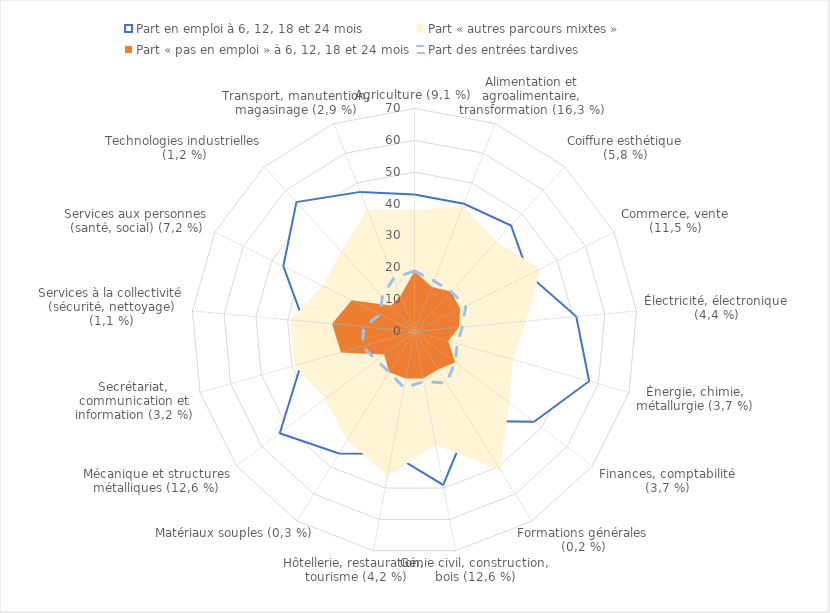
| Category | Part en emploi à 6, 12, 18 et 24 mois | Part « autres parcours mixtes » | Part « pas en emploi » à 6, 12, 18 et 24 mois | Part des entrées tardives |
|---|---|---|---|---|
| Agriculture (9,1 %) | 43 | 38 | 19 | 19 |
| Alimentation et agroalimentaire, transformation (16,3 %) | 43 | 42 | 15 | 17 |
| Coiffure esthétique (5,8 %) | 45 | 38 | 17 | 17 |
| Commerce, vente (11,5 %) | 40 | 44 | 16 | 18 |
| Électricité, électronique (4,4 %) | 51 | 35 | 14 | 15 |
| Énergie, chimie, métallurgie (3,7 %) | 57 | 32 | 11 | 14 |
| Finances, comptabilité (3,7 %) | 47 | 37 | 16 | 16 |
| Formations générales (0,2 %) | 33 | 51 | 14 | 19 |
| Génie civil, construction, bois (12,6 %) | 49 | 36 | 15 | 16 |
| Hôtellerie, restauration, tourisme (4,2 %) | 39 | 46 | 15 | 18 |
| Matériaux souples (0,3 %) | 45 | 40 | 15 | 15 |
| Mécanique et structures métalliques (12,6 %) | 53 | 35 | 12 | 15 |
| Secrétariat, communication et information (3,2 %) | 37 | 39 | 24 | 17 |
| Services à la collectivité (sécurité, nettoyage) (1,1 %) | 35 | 39 | 26 | 16 |
| Services aux personnes (santé, social) (7,2 %) | 46 | 32 | 22 | 12 |
| Technologies industrielles (1,2 %) | 55 | 34 | 11 | 15 |
| Transport, manutention, magasinage (2,9 %) | 47 | 41 | 12 | 18 |